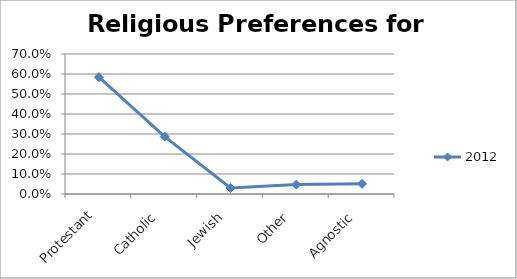
| Category | 2012 |
|---|---|
| Protestant | 0.584 |
| Catholic  | 0.287 |
| Jewish  | 0.03 |
| Other  | 0.047 |
| Agnostic  | 0.051 |